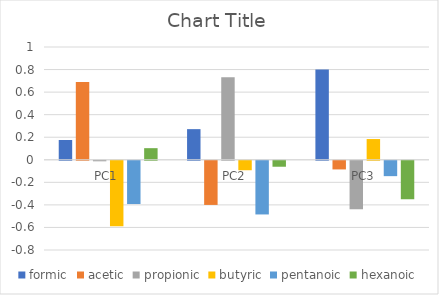
| Category | formic | acetic | propionic | butyric | pentanoic | hexanoic |
|---|---|---|---|---|---|---|
| PC1 | 0.175 | 0.69 | -0.005 | -0.58 | -0.384 | 0.103 |
| PC2 | 0.272 | -0.391 | 0.733 | -0.084 | -0.476 | -0.053 |
| PC3 | 0.8 | -0.077 | -0.43 | 0.184 | -0.136 | -0.341 |